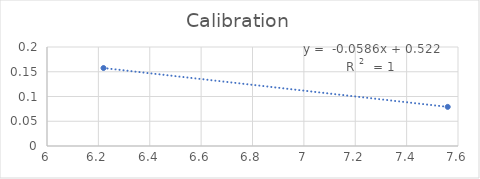
| Category | Series 0 |
|---|---|
| 6.22 | 0.158 |
| 7.56 | 0.079 |